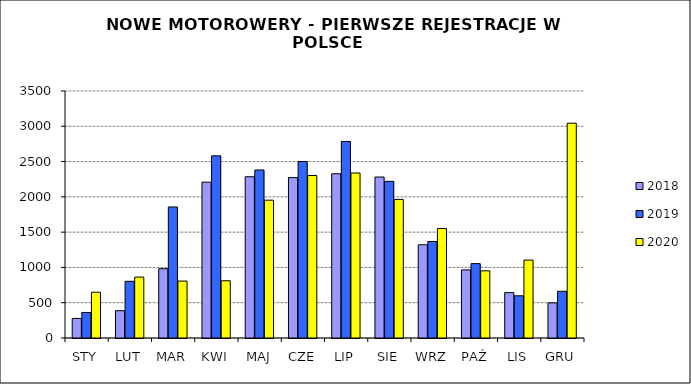
| Category | 2018 | 2019 | 2020 |
|---|---|---|---|
|  STY  | 277 | 362 | 649 |
|  LUT  | 387 | 803 | 863 |
| MAR | 982 | 1857 | 807 |
| KWI | 2208 | 2581 | 811 |
| MAJ | 2285 | 2381 | 1953 |
| CZE | 2273 | 2501 | 2303 |
| LIP | 2327 | 2785 | 2338 |
| SIE | 2281 | 2220 | 1964 |
| WRZ | 1321 | 1367 | 1552 |
| PAŹ | 965 | 1054 | 952 |
| LIS | 643 | 598 | 1104 |
| GRU | 498 | 662 | 3044 |